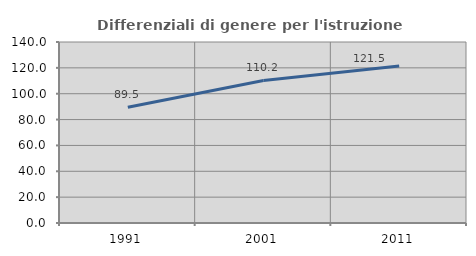
| Category | Differenziali di genere per l'istruzione superiore |
|---|---|
| 1991.0 | 89.481 |
| 2001.0 | 110.226 |
| 2011.0 | 121.515 |